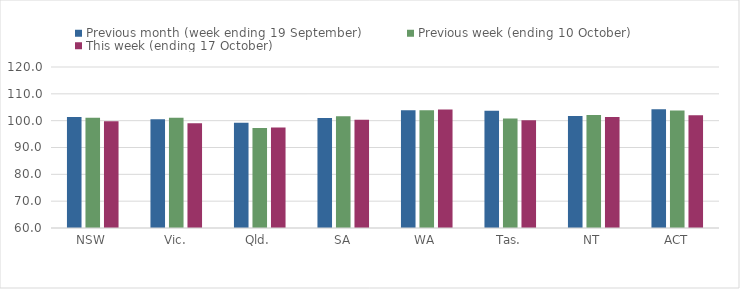
| Category | Previous month (week ending 19 September) | Previous week (ending 10 October) | This week (ending 17 October) |
|---|---|---|---|
| NSW | 101.35 | 101.07 | 99.74 |
| Vic. | 100.5 | 101.1 | 99.01 |
| Qld. | 99.18 | 97.31 | 97.44 |
| SA | 101.04 | 101.63 | 100.38 |
| WA | 103.89 | 103.89 | 104.14 |
| Tas. | 103.74 | 100.83 | 100.11 |
| NT | 101.73 | 102.13 | 101.4 |
| ACT | 104.28 | 103.81 | 102 |